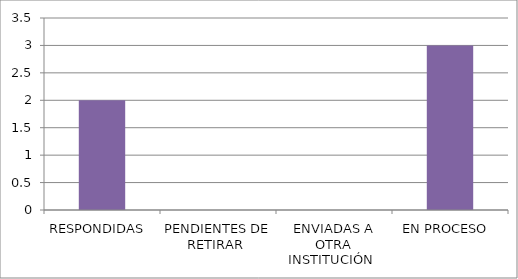
| Category | Series 0 |
|---|---|
| RESPONDIDAS  | 2 |
| PENDIENTES DE RETIRAR  | 0 |
| ENVIADAS A OTRA INSTITUCIÓN  | 0 |
| EN PROCESO  | 3 |